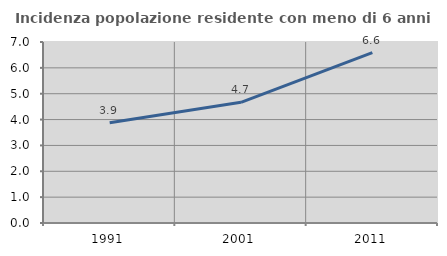
| Category | Incidenza popolazione residente con meno di 6 anni |
|---|---|
| 1991.0 | 3.878 |
| 2001.0 | 4.668 |
| 2011.0 | 6.593 |